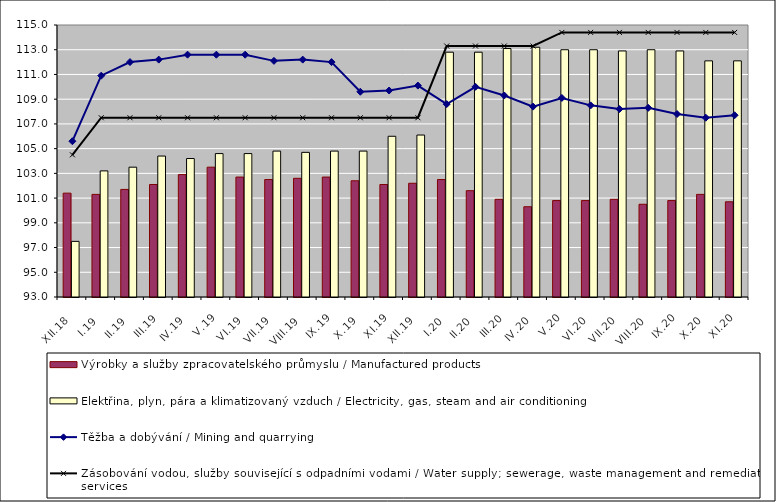
| Category | Výrobky a služby zpracovatelského průmyslu / Manufactured products | Elektřina, plyn, pára a klimatizovaný vzduch / Electricity, gas, steam and air conditioning |
|---|---|---|
| XII.18 | 101.4 | 97.5 |
| I.19 | 101.3 | 103.2 |
| II.19 | 101.7 | 103.5 |
| III.19 | 102.1 | 104.4 |
| IV.19 | 102.9 | 104.2 |
| V.19 | 103.5 | 104.6 |
| VI.19 | 102.7 | 104.6 |
| VII.19 | 102.5 | 104.8 |
| VIII.19 | 102.6 | 104.7 |
| IX.19 | 102.7 | 104.8 |
| X.19 | 102.4 | 104.8 |
| XI.19 | 102.1 | 106 |
| XII.19 | 102.2 | 106.1 |
| I.20 | 102.5 | 112.8 |
| II.20 | 101.6 | 112.8 |
| III.20 | 100.9 | 113.1 |
| IV.20 | 100.3 | 113.2 |
| V.20 | 100.8 | 113 |
| VI.20 | 100.8 | 113 |
| VII.20 | 100.9 | 112.9 |
| VIII.20 | 100.5 | 113 |
| IX.20 | 100.8 | 112.9 |
| X.20 | 101.3 | 112.1 |
| XI.20 | 100.7 | 112.1 |